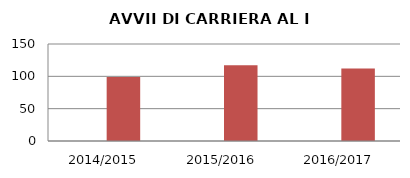
| Category | ANNO | NUMERO |
|---|---|---|
| 2014/2015 | 0 | 99 |
| 2015/2016 | 0 | 117 |
| 2016/2017 | 0 | 112 |